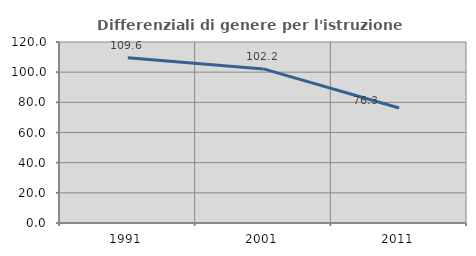
| Category | Differenziali di genere per l'istruzione superiore |
|---|---|
| 1991.0 | 109.555 |
| 2001.0 | 102.177 |
| 2011.0 | 76.251 |